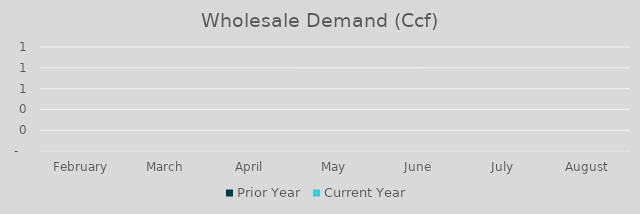
| Category | Prior Year | Current Year |
|---|---|---|
| February | 0 | 0 |
| March | 0 | 0 |
| April | 0 | 0 |
| May | 0 | 0 |
| June | 0 | 0 |
| July | 0 | 0 |
| August | 0 | 0 |